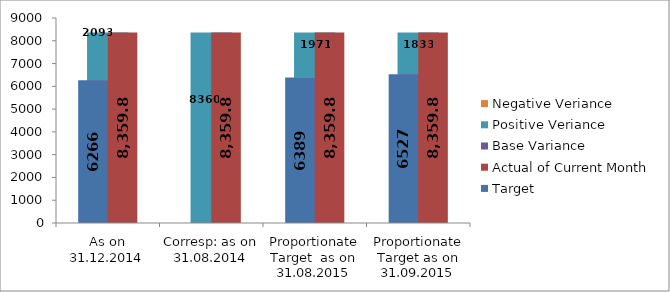
| Category | Base Variance | Positive Veriance | Negative Veriance |
|---|---|---|---|
| As on 31.12.2014 | 6266.495 | 2093.379 | 0 |
| Corresp: as on 31.08.2014 | 0 | 8359.874 | 0 |
| Proportionate Target  as on 31.08.2015 | 6389.109 | 1970.765 | 0 |
| Proportionate Target as on 31.09.2015 | 6526.867 | 1833.007 | 0 |